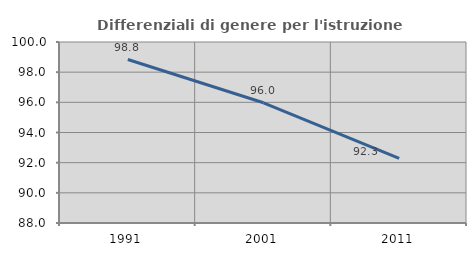
| Category | Differenziali di genere per l'istruzione superiore |
|---|---|
| 1991.0 | 98.839 |
| 2001.0 | 95.971 |
| 2011.0 | 92.287 |